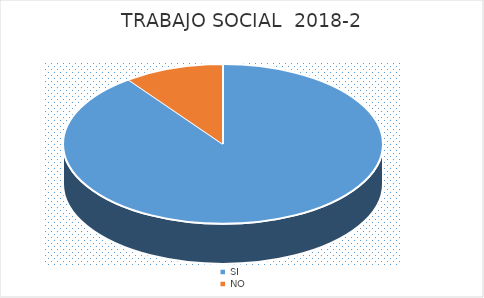
| Category | Series 0 |
|---|---|
| SI | 125 |
| NO | 14 |